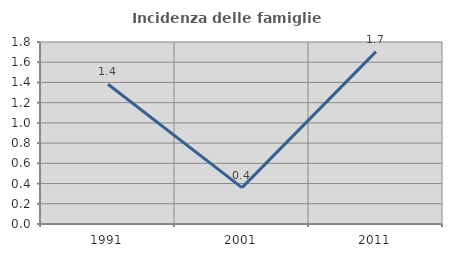
| Category | Incidenza delle famiglie numerose |
|---|---|
| 1991.0 | 1.382 |
| 2001.0 | 0.36 |
| 2011.0 | 1.705 |